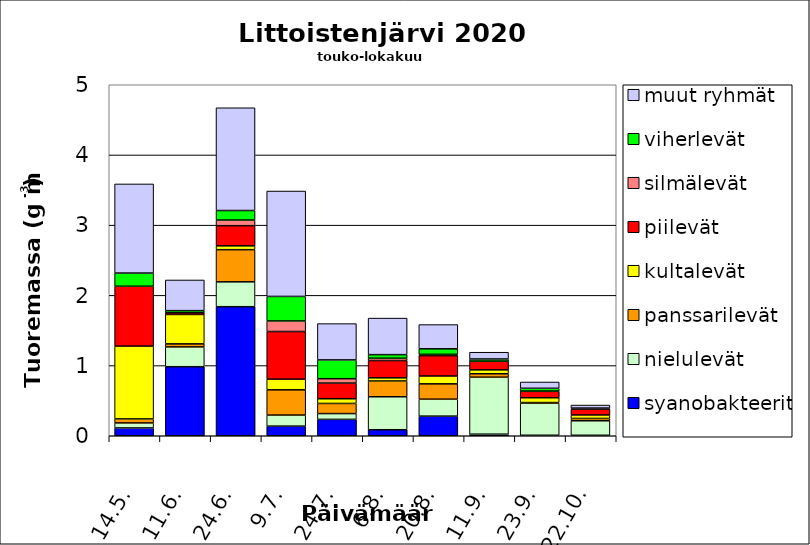
| Category | syanobakteerit | nielulevät | panssarilevät | kultalevät | piilevät | silmälevät | viherlevät | muut ryhmät |
|---|---|---|---|---|---|---|---|---|
| 14.5. | 0.111 | 0.071 | 0.057 | 1.038 | 0.852 | 0 | 0.187 | 1.27 |
| 11.6. | 0.984 | 0.282 | 0.043 | 0.419 | 0.023 | 0 | 0.031 | 0.437 |
| 24.6. | 1.838 | 0.354 | 0.458 | 0.055 | 0.287 | 0.081 | 0.135 | 1.464 |
| 9.7. | 0.137 | 0.158 | 0.359 | 0.153 | 0.678 | 0.151 | 0.349 | 1.502 |
| 24.7. | 0.233 | 0.082 | 0.144 | 0.067 | 0.223 | 0.063 | 0.268 | 0.517 |
| 6.8. | 0.086 | 0.47 | 0.225 | 0.045 | 0.246 | 0.033 | 0.051 | 0.52 |
| 20.8. | 0.28 | 0.242 | 0.218 | 0.112 | 0.29 | 0.019 | 0.079 | 0.345 |
| 11.9. | 0.023 | 0.812 | 0.049 | 0.056 | 0.124 | 0.001 | 0.03 | 0.096 |
| 23.9. | 0.007 | 0.458 | 0.008 | 0.069 | 0.092 | 0.004 | 0.039 | 0.09 |
| 22.10. | 0.007 | 0.207 | 0.033 | 0.05 | 0.084 | 0.005 | 0.009 | 0.043 |